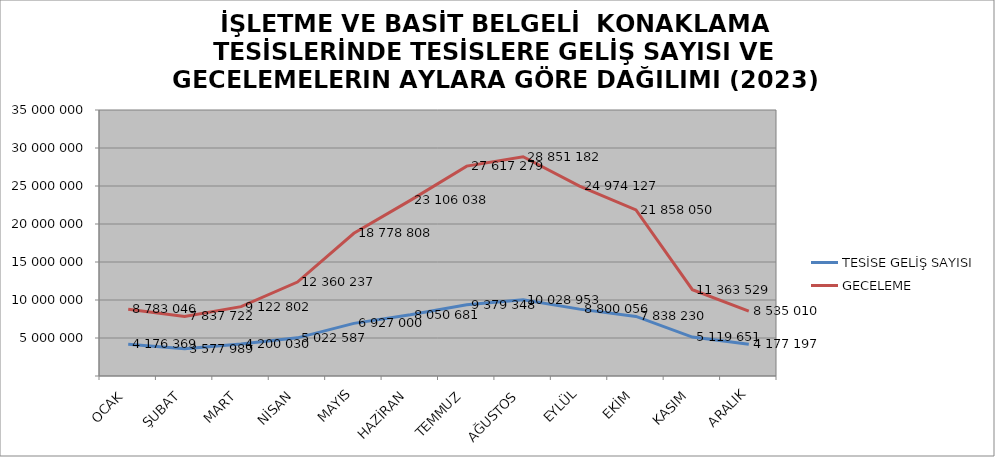
| Category | TESİSE GELİŞ SAYISI | GECELEME |
|---|---|---|
| OCAK | 4176369 | 8783046 |
| ŞUBAT | 3577989 | 7837722 |
| MART | 4200030 | 9122802 |
| NİSAN | 5022587 | 12360237 |
| MAYIS | 6927000 | 18778808 |
| HAZİRAN | 8050681 | 23106038 |
| TEMMUZ | 9379348 | 27617279 |
| AĞUSTOS | 10028953 | 28851182 |
| EYLÜL | 8800056 | 24974127 |
| EKİM | 7838230 | 21858050 |
| KASIM | 5119651 | 11363529 |
| ARALIK | 4177197 | 8535010 |